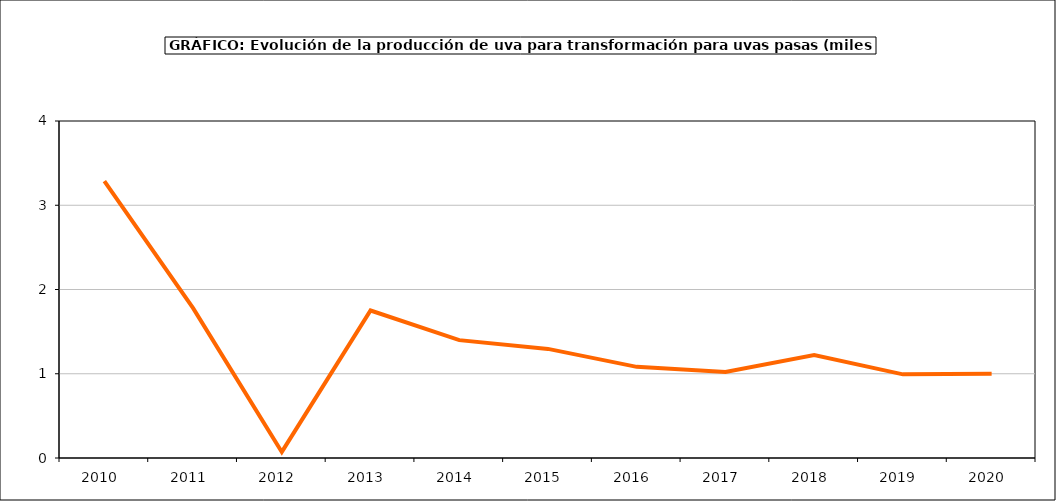
| Category | producción |
|---|---|
| 2010.0 | 3.286 |
| 2011.0 | 1.779 |
| 2012.0 | 0.072 |
| 2013.0 | 1.751 |
| 2014.0 | 1.399 |
| 2015.0 | 1.295 |
| 2016.0 | 1.082 |
| 2017.0 | 1.02 |
| 2018.0 | 1.223 |
| 2019.0 | 0.993 |
| 2020.0 | 0.999 |